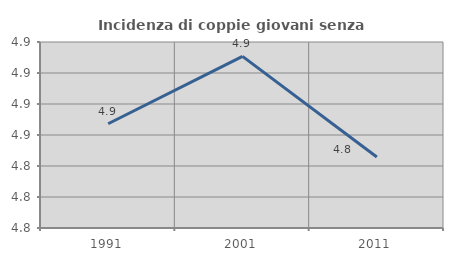
| Category | Incidenza di coppie giovani senza figli |
|---|---|
| 1991.0 | 4.867 |
| 2001.0 | 4.911 |
| 2011.0 | 4.846 |